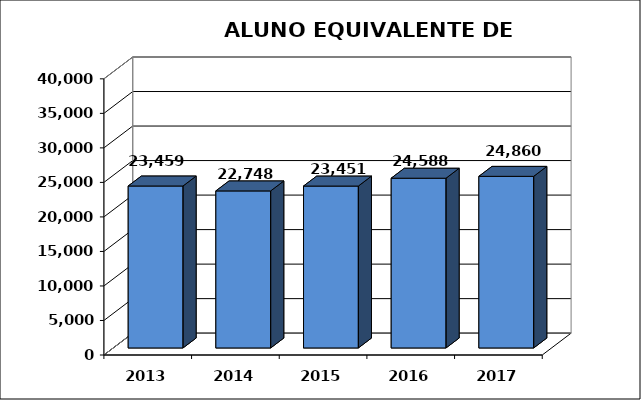
| Category | Series 0 |
|---|---|
| 2013.0 | 23459.371 |
| 2014.0 | 22747.712 |
| 2015.0 | 23451.239 |
| 2016.0 | 24588 |
| 2017.0 | 24860.124 |